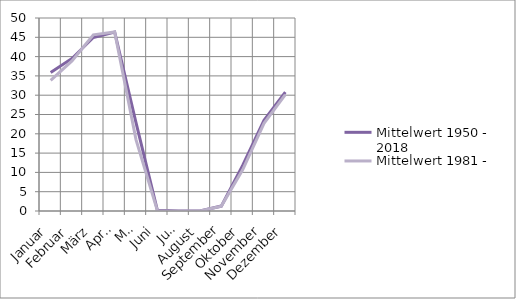
| Category | Mittelwert 1950 - 2018 | Mittelwert 1981 - 2010 |
|---|---|---|
| Januar | 35.853 | 33.867 |
| Februar | 39.522 | 38.867 |
| März | 44.942 | 45.633 |
| April | 46.348 | 46.367 |
| Mai | 22.899 | 18.5 |
| Juni | 0.246 | 0.133 |
| Juli | 0 | 0 |
| August | 0 | 0 |
| September | 1.275 | 1.267 |
| Oktober | 11.794 | 10.667 |
| November | 23.507 | 22.7 |
| Dezember | 30.783 | 30.167 |